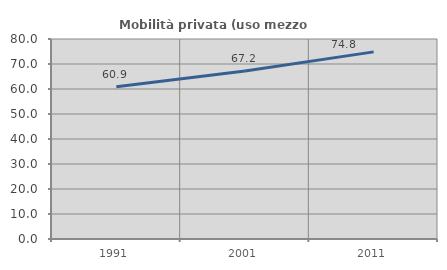
| Category | Mobilità privata (uso mezzo privato) |
|---|---|
| 1991.0 | 60.938 |
| 2001.0 | 67.221 |
| 2011.0 | 74.847 |